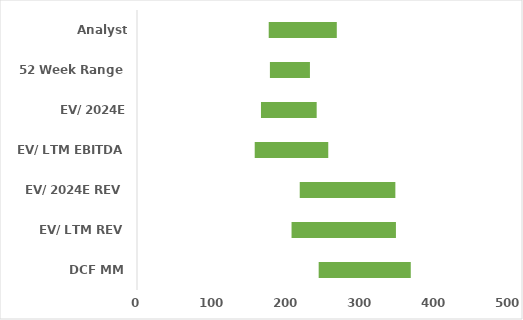
| Category | Series 0 | Series 1 | Series 2 |
|---|---|---|---|
| DCF MM | 245.511 | 124.451 | 369.962 |
| EV/ LTM REV | 208.85 | 141.063 | 349.913 |
| EV/ 2024E REV | 219.914 | 129.215 | 349.13 |
| EV/ LTM EBITDA | 159.079 | 99.384 | 258.464 |
| EV/ 2024E EBITDA | 167.541 | 75.265 | 242.807 |
| 52 Week Range | 179.61 | 54.08 | 233.69 |
| Analyst Consensus | 178 | 92 | 270 |